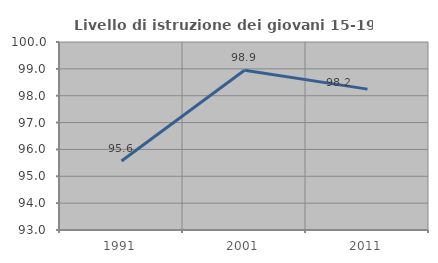
| Category | Livello di istruzione dei giovani 15-19 anni |
|---|---|
| 1991.0 | 95.57 |
| 2001.0 | 98.947 |
| 2011.0 | 98.246 |